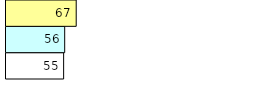
| Category | Total Standouts | Total Recd | Total Tipsters |
|---|---|---|---|
| 0 | 55 | 56 | 67 |